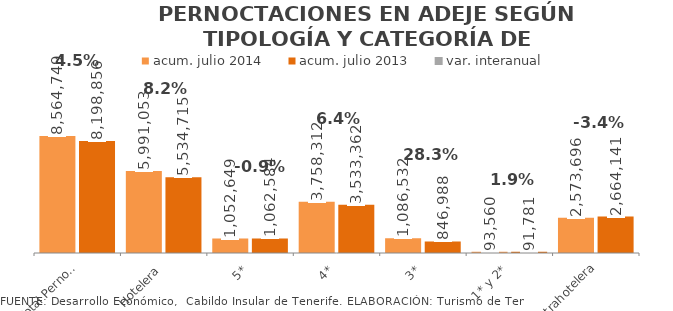
| Category | acum. julio 2014 | acum. julio 2013 |
|---|---|---|
| Total Pernoctaciones | 8564749 | 8198856 |
| Hotelera | 5991053 | 5534715 |
| 5* | 1052649 | 1062584 |
| 4* | 3758312 | 3533362 |
| 3* | 1086532 | 846988 |
| 1* y 2* | 93560 | 91781 |
| Extrahotelera | 2573696 | 2664141 |